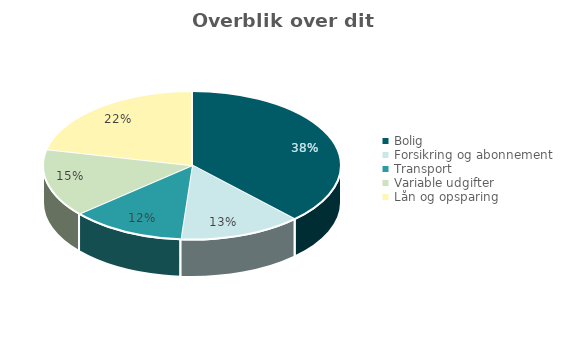
| Category | Series 0 |
|---|---|
| Bolig | 5283.333 |
| Forsikring og abonnement | 1853.333 |
| Transport | 1737.5 |
| Variable udgifter | 2058.333 |
| Lån og opsparing | 3000 |